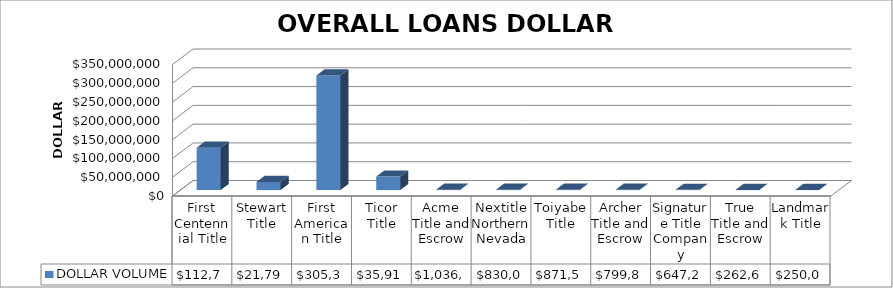
| Category | DOLLAR VOLUME |
|---|---|
| First Centennial Title | 112758645.23 |
| Stewart Title | 21798790.01 |
| First American Title | 305314461 |
| Ticor Title | 35918198.33 |
| Acme Title and Escrow | 1036460 |
| Nextitle Northern Nevada | 830000 |
| Toiyabe Title | 871500 |
| Archer Title and Escrow | 799850 |
| Signature Title Company | 647200 |
| True Title and Escrow | 262650 |
| Landmark Title | 250000 |